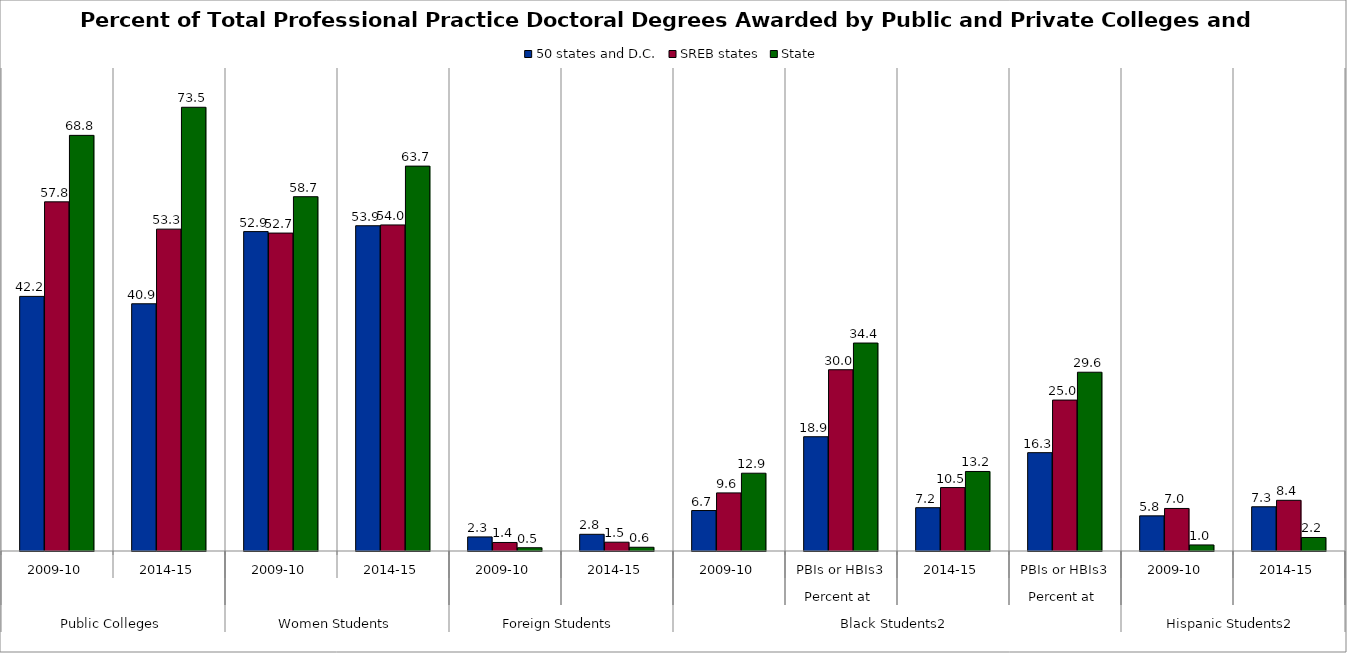
| Category | 50 states and D.C. | SREB states | State |
|---|---|---|---|
| 0 | 42.171 | 57.832 | 68.843 |
| 1 | 40.948 | 53.312 | 73.495 |
| 2 | 52.904 | 52.659 | 58.681 |
| 3 | 53.874 | 54.004 | 63.749 |
| 4 | 2.33 | 1.412 | 0.538 |
| 5 | 2.765 | 1.457 | 0.621 |
| 6 | 6.702 | 9.623 | 12.885 |
| 7 | 18.926 | 30.026 | 34.444 |
| 8 | 7.173 | 10.505 | 13.171 |
| 9 | 16.288 | 25 | 29.612 |
| 10 | 5.82 | 7.047 | 1.002 |
| 11 | 7.325 | 8.397 | 2.238 |